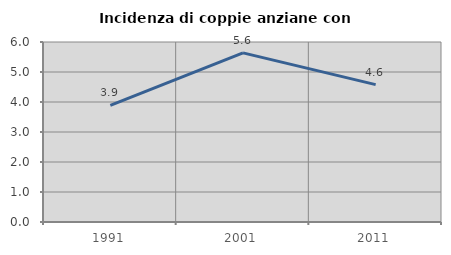
| Category | Incidenza di coppie anziane con figli |
|---|---|
| 1991.0 | 3.89 |
| 2001.0 | 5.637 |
| 2011.0 | 4.58 |